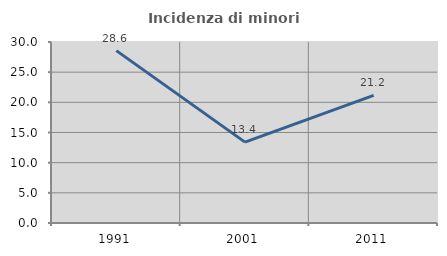
| Category | Incidenza di minori stranieri |
|---|---|
| 1991.0 | 28.571 |
| 2001.0 | 13.402 |
| 2011.0 | 21.154 |